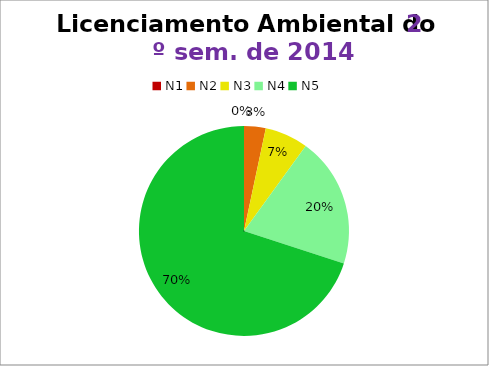
| Category | 2º/14 |
|---|---|
| N1 | 0 |
| N2 | 1 |
| N3 | 2 |
| N4 | 6 |
| N5 | 21 |